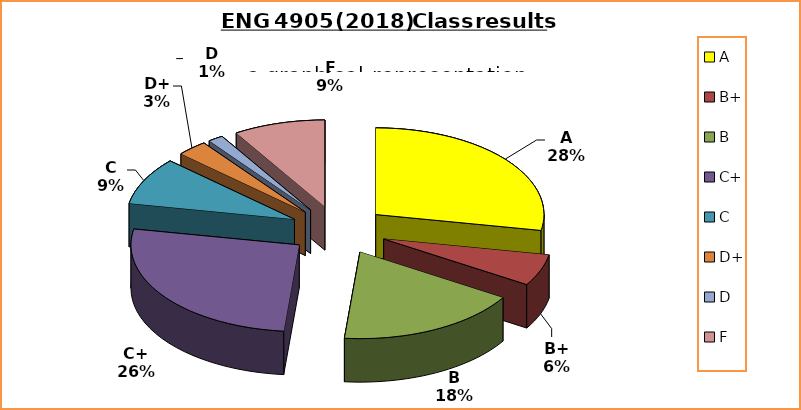
| Category | Series 0 |
|---|---|
| A | 19 |
| B+ | 4 |
| B | 12 |
| C+ | 18 |
| C | 6 |
| D+ | 2 |
| D | 1 |
| F | 6 |